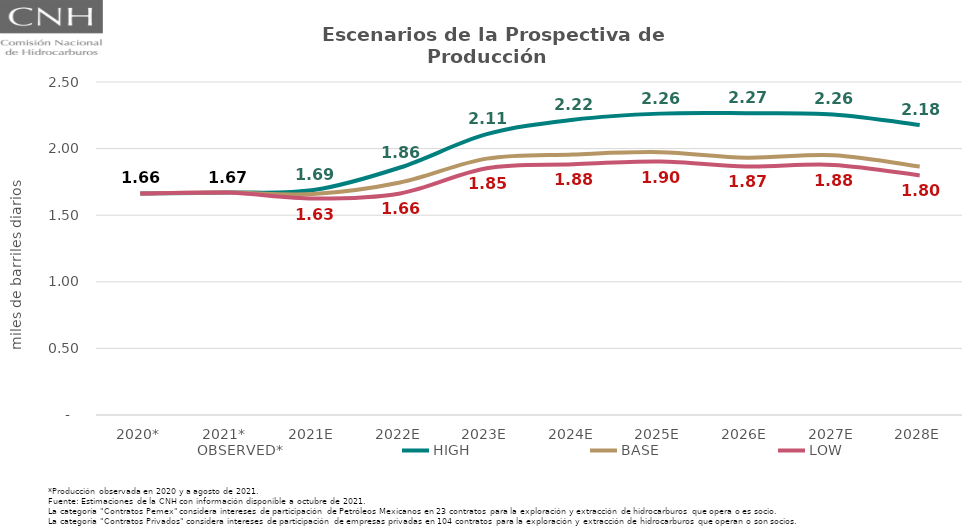
| Category | OBSERVED* | HIGH | BASE | LOW |
|---|---|---|---|---|
| 2020* | 1.663 | 1.663 | 1.663 | 1.663 |
| 2021* | 1.67 | 1.67 | 1.67 | 1.67 |
| 2021E | 1.689 | 1.689 | 1.659 | 1.625 |
| 2022E | 1.858 | 1.858 | 1.746 | 1.664 |
| 2023E | 2.108 | 2.108 | 1.925 | 1.852 |
| 2024E | 2.217 | 2.217 | 1.956 | 1.882 |
| 2025E | 2.263 | 2.263 | 1.973 | 1.902 |
| 2026E | 2.266 | 2.266 | 1.932 | 1.866 |
| 2027E | 2.256 | 2.256 | 1.95 | 1.877 |
| 2028E | 2.178 | 2.178 | 1.866 | 1.799 |